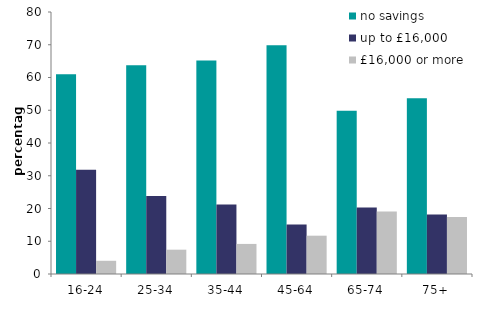
| Category | no savings | up to £16,000 | £16,000 or more |
|---|---|---|---|
| 16-24 | 60.992 | 31.855 | 4.034 |
| 25-34 | 63.752 | 23.789 | 7.426 |
| 35-44 | 65.197 | 21.238 | 9.184 |
| 45-64 | 69.809 | 15.079 | 11.698 |
| 65-74 | 49.883 | 20.309 | 19.052 |
| 75+ | 53.659 | 18.144 | 17.405 |